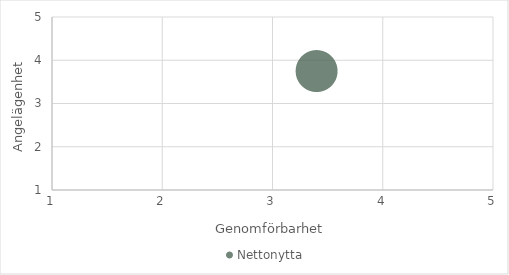
| Category | Nettonytta |
|---|---|
| 3.4 | 3.75 |